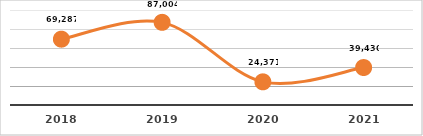
| Category | CERTIFICACIÓN DE COMPETENCIAS (%)
PRIMER SEMESTRE, EJERCICIO 2021 |
|---|---|
| 2018.0 | 69287 |
| 2019.0 | 87004 |
| 2020.0 | 24371 |
| 2021.0 | 39430 |